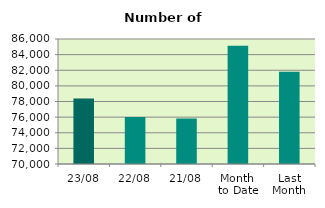
| Category | Series 0 |
|---|---|
| 23/08 | 78394 |
| 22/08 | 76010 |
| 21/08 | 75840 |
| Month 
to Date | 85134.941 |
| Last
Month | 81818 |